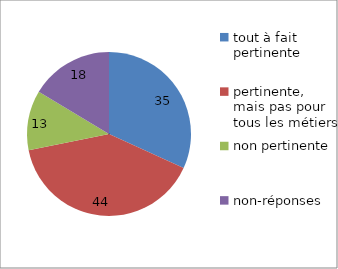
| Category | Series 0 |
|---|---|
| tout à fait pertinente | 35 |
| pertinente, mais pas pour tous les métiers | 44 |
| non pertinente | 13 |
| non-réponses | 18 |